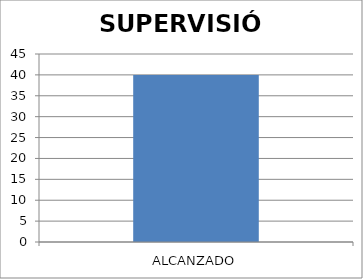
| Category | SUPERVISIÓN |
|---|---|
| ALCANZADO | 40 |